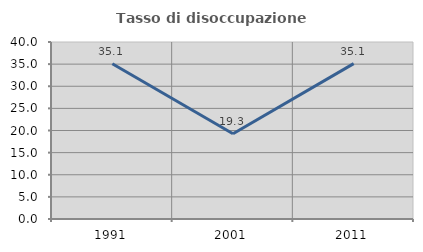
| Category | Tasso di disoccupazione giovanile  |
|---|---|
| 1991.0 | 35.093 |
| 2001.0 | 19.251 |
| 2011.0 | 35.119 |